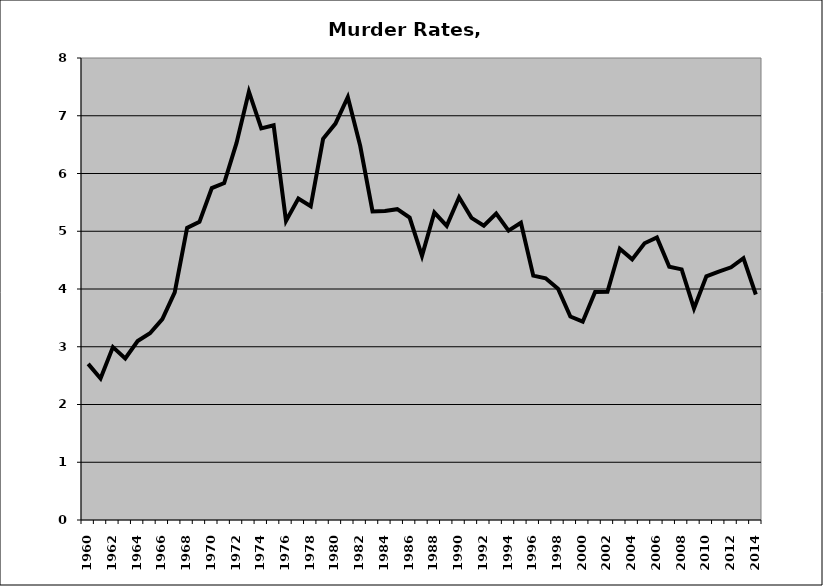
| Category | Murder |
|---|---|
| 1960.0 | 2.703 |
| 1961.0 | 2.45 |
| 1962.0 | 2.994 |
| 1963.0 | 2.798 |
| 1964.0 | 3.098 |
| 1965.0 | 3.233 |
| 1966.0 | 3.479 |
| 1967.0 | 3.941 |
| 1968.0 | 5.058 |
| 1969.0 | 5.162 |
| 1970.0 | 5.748 |
| 1971.0 | 5.836 |
| 1972.0 | 6.529 |
| 1973.0 | 7.417 |
| 1974.0 | 6.78 |
| 1975.0 | 6.834 |
| 1976.0 | 5.18 |
| 1977.0 | 5.567 |
| 1978.0 | 5.432 |
| 1979.0 | 6.601 |
| 1980.0 | 6.864 |
| 1981.0 | 7.323 |
| 1982.0 | 6.48 |
| 1983.0 | 5.343 |
| 1984.0 | 5.349 |
| 1985.0 | 5.382 |
| 1986.0 | 5.236 |
| 1987.0 | 4.575 |
| 1988.0 | 5.324 |
| 1989.0 | 5.093 |
| 1990.0 | 5.588 |
| 1991.0 | 5.232 |
| 1992.0 | 5.097 |
| 1993.0 | 5.305 |
| 1994.0 | 5.01 |
| 1995.0 | 5.148 |
| 1996.0 | 4.231 |
| 1997.0 | 4.185 |
| 1998.0 | 4.005 |
| 1999.0 | 3.524 |
| 2000.0 | 3.435 |
| 2001.0 | 3.948 |
| 2002.0 | 3.953 |
| 2003.0 | 4.698 |
| 2004.0 | 4.513 |
| 2005.0 | 4.791 |
| 2006.0 | 4.894 |
| 2007.0 | 4.386 |
| 2008.0 | 4.34 |
| 2009.0 | 3.663 |
| 2010.0 | 4.22 |
| 2011.0 | 4.301 |
| 2012.0 | 4.375 |
| 2013.0 | 4.533 |
| 2014.0 | 3.905 |